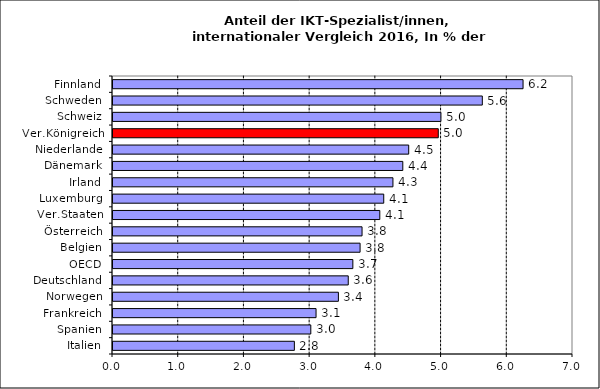
| Category | IKT-Spezialist/innen |
|---|---|
| Italien | 2.76 |
| Spanien | 3.01 |
| Frankreich | 3.09 |
| Norwegen | 3.43 |
| Deutschland | 3.58 |
| OECD | 3.65 |
| Belgien | 3.76 |
| Österreich | 3.79 |
| Ver.Staaten | 4.06 |
| Luxemburg | 4.12 |
| Irland | 4.26 |
| Dänemark | 4.41 |
| Niederlande | 4.5 |
| Ver.Königreich | 4.95 |
| Schweiz | 4.99 |
| Schweden | 5.62 |
| Finnland | 6.24 |